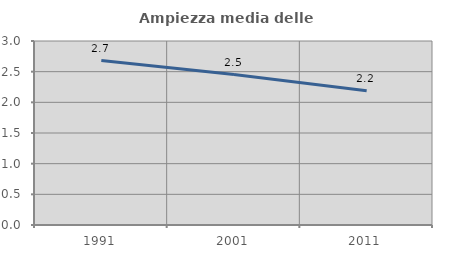
| Category | Ampiezza media delle famiglie |
|---|---|
| 1991.0 | 2.682 |
| 2001.0 | 2.453 |
| 2011.0 | 2.19 |